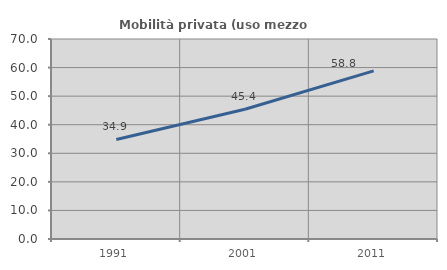
| Category | Mobilità privata (uso mezzo privato) |
|---|---|
| 1991.0 | 34.852 |
| 2001.0 | 45.407 |
| 2011.0 | 58.84 |